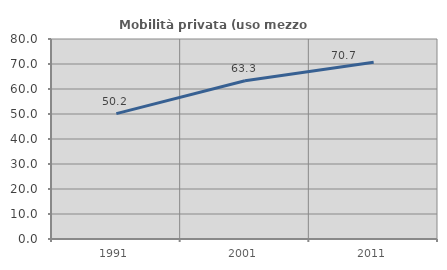
| Category | Mobilità privata (uso mezzo privato) |
|---|---|
| 1991.0 | 50.167 |
| 2001.0 | 63.331 |
| 2011.0 | 70.73 |